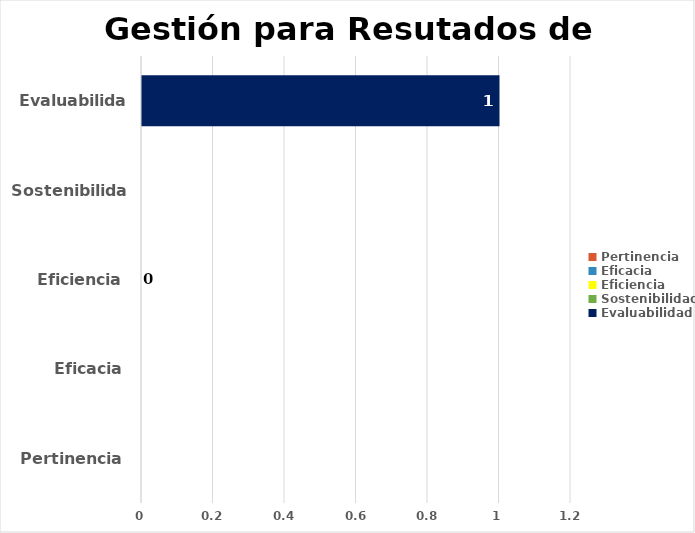
| Category | Series 2 |
|---|---|
| Pertinencia | 0 |
| Eficacia | 0 |
| Eficiencia | 0 |
| Sostenibilidad | 0 |
| Evaluabilidad | 1 |